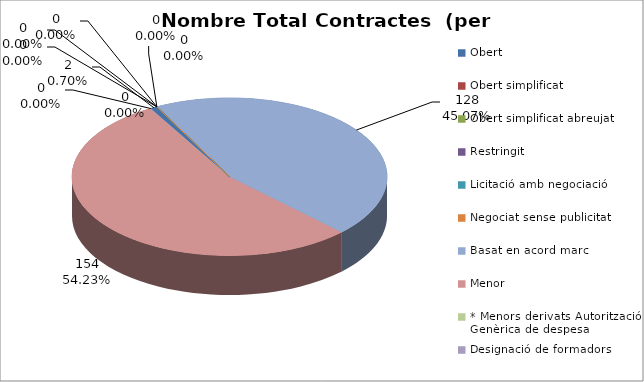
| Category | Nombre Total Contractes |
|---|---|
| Obert | 2 |
| Obert simplificat | 0 |
| Obert simplificat abreujat | 0 |
| Restringit | 0 |
| Licitació amb negociació | 0 |
| Negociat sense publicitat | 0 |
| Basat en acord marc | 128 |
| Menor | 154 |
| * Menors derivats Autorització Genèrica de despesa | 0 |
| Designació de formadors | 0 |